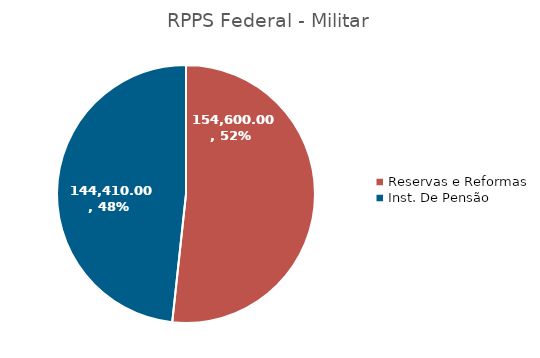
| Category | Series 0 |
|---|---|
| Reservas e Reformas | 154600 |
| Inst. De Pensão | 144410 |